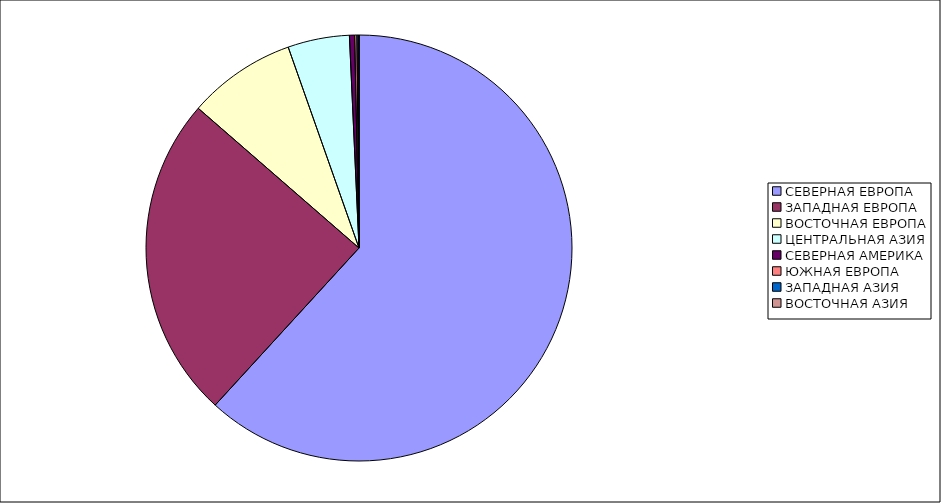
| Category | Оборот |
|---|---|
| СЕВЕРНАЯ ЕВРОПА | 61.797 |
| ЗАПАДНАЯ ЕВРОПА | 24.589 |
| ВОСТОЧНАЯ ЕВРОПА | 8.22 |
| ЦЕНТРАЛЬНАЯ АЗИЯ | 4.674 |
| СЕВЕРНАЯ АМЕРИКА | 0.391 |
| ЮЖНАЯ ЕВРОПА | 0.173 |
| ЗАПАДНАЯ АЗИЯ | 0.154 |
| ВОСТОЧНАЯ АЗИЯ | 0 |